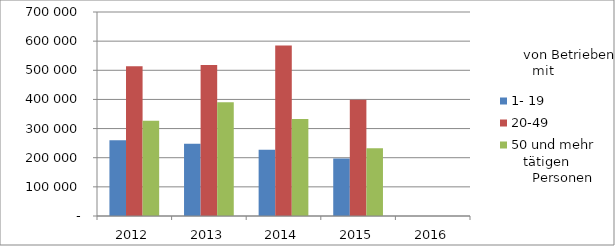
| Category | 1- 19 | 20-49 | 50 und mehr |
|---|---|---|---|
| 2012.0 | 259910.785 | 514143.634 | 327082.591 |
| 2013.0 | 247934.383 | 518337.491 | 390032.948 |
| 2014.0 | 227132.521 | 584877.621 | 332909.543 |
| 2015.0 | 196941.16 | 399161.973 | 232434.682 |
| 2016.0 | 0 | 0 | 0 |